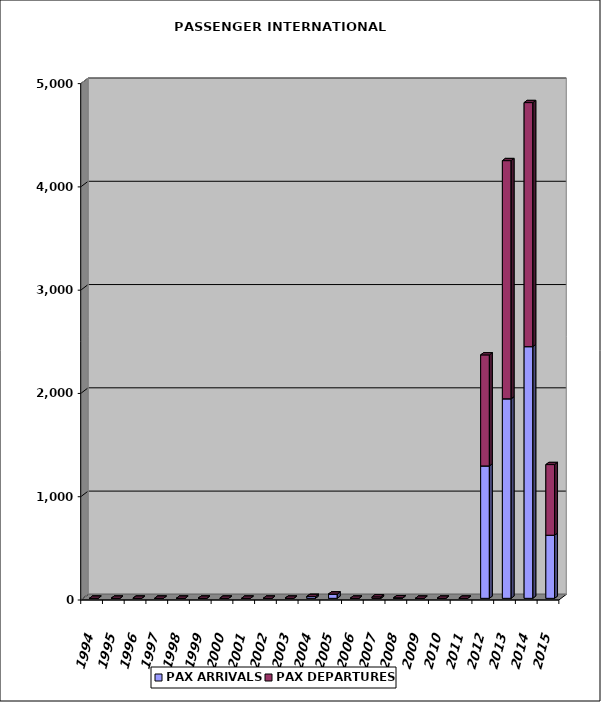
| Category | PAX ARRIVALS | PAX DEPARTURES |
|---|---|---|
| 1994.0 | 0 | 0 |
| 1995.0 | 0 | 0 |
| 1996.0 | 0 | 0 |
| 1997.0 | 0 | 0 |
| 1998.0 | 0 | 0 |
| 1999.0 | 0 | 0 |
| 2000.0 | 0 | 0 |
| 2001.0 | 0 | 0 |
| 2002.0 | 0 | 0 |
| 2003.0 | 0 | 0 |
| 2004.0 | 17 | 0 |
| 2005.0 | 41 | 0 |
| 2006.0 | 0 | 0 |
| 2007.0 | 0 | 14 |
| 2008.0 | 5 | 0 |
| 2009.0 | 0 | 0 |
| 2010.0 | 0 | 0 |
| 2011.0 | 0 | 0 |
| 2012.0 | 1282 | 1075 |
| 2013.0 | 1932 | 2306 |
| 2014.0 | 2437 | 2363 |
| 2015.0 | 611 | 684 |